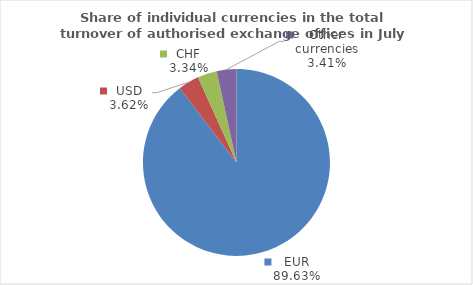
| Category | Series 0 |
|---|---|
| EUR | 89.631 |
| USD | 3.616 |
| CHF | 3.345 |
| Other currencies | 3.408 |